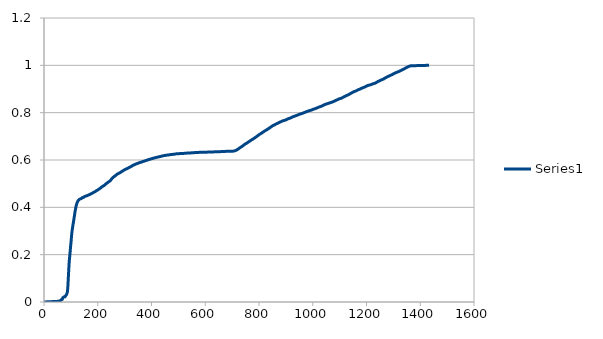
| Category | Series 0 |
|---|---|
| 0.0 | 0 |
| 56.0 | 0.003 |
| 59.0 | 0.004 |
| 60.0 | 0.005 |
| 63.0 | 0.007 |
| 64.0 | 0.009 |
| 65.0 | 0.01 |
| 66.0 | 0.01 |
| 68.0 | 0.011 |
| 69.0 | 0.012 |
| 70.0 | 0.018 |
| 74.0 | 0.021 |
| 75.0 | 0.022 |
| 77.0 | 0.022 |
| 78.0 | 0.022 |
| 79.0 | 0.022 |
| 80.0 | 0.024 |
| 81.0 | 0.027 |
| 82.0 | 0.031 |
| 83.0 | 0.031 |
| 84.0 | 0.032 |
| 85.0 | 0.033 |
| 86.0 | 0.035 |
| 87.0 | 0.043 |
| 88.0 | 0.054 |
| 89.0 | 0.069 |
| 90.0 | 0.092 |
| 91.0 | 0.114 |
| 92.0 | 0.134 |
| 93.0 | 0.155 |
| 94.0 | 0.173 |
| 95.0 | 0.184 |
| 96.0 | 0.196 |
| 97.0 | 0.209 |
| 98.0 | 0.222 |
| 99.0 | 0.235 |
| 100.0 | 0.246 |
| 101.0 | 0.259 |
| 102.0 | 0.272 |
| 103.0 | 0.285 |
| 104.0 | 0.296 |
| 105.0 | 0.305 |
| 106.0 | 0.312 |
| 107.0 | 0.32 |
| 108.0 | 0.327 |
| 109.0 | 0.334 |
| 110.0 | 0.341 |
| 111.0 | 0.348 |
| 112.0 | 0.355 |
| 113.0 | 0.363 |
| 114.0 | 0.37 |
| 115.0 | 0.379 |
| 116.0 | 0.385 |
| 117.0 | 0.391 |
| 118.0 | 0.396 |
| 119.0 | 0.403 |
| 120.0 | 0.408 |
| 121.0 | 0.412 |
| 122.0 | 0.416 |
| 123.0 | 0.419 |
| 124.0 | 0.422 |
| 125.0 | 0.424 |
| 126.0 | 0.427 |
| 127.0 | 0.429 |
| 128.0 | 0.431 |
| 129.0 | 0.432 |
| 130.0 | 0.433 |
| 131.0 | 0.433 |
| 132.0 | 0.434 |
| 133.0 | 0.434 |
| 134.0 | 0.435 |
| 135.0 | 0.436 |
| 136.0 | 0.437 |
| 137.0 | 0.437 |
| 138.0 | 0.437 |
| 139.0 | 0.437 |
| 140.0 | 0.439 |
| 141.0 | 0.44 |
| 142.0 | 0.441 |
| 143.0 | 0.441 |
| 144.0 | 0.441 |
| 145.0 | 0.441 |
| 146.0 | 0.442 |
| 147.0 | 0.442 |
| 148.0 | 0.443 |
| 149.0 | 0.444 |
| 150.0 | 0.445 |
| 151.0 | 0.446 |
| 152.0 | 0.446 |
| 153.0 | 0.447 |
| 154.0 | 0.447 |
| 155.0 | 0.447 |
| 156.0 | 0.448 |
| 158.0 | 0.449 |
| 159.0 | 0.449 |
| 160.0 | 0.449 |
| 161.0 | 0.45 |
| 162.0 | 0.45 |
| 163.0 | 0.451 |
| 164.0 | 0.451 |
| 165.0 | 0.451 |
| 166.0 | 0.452 |
| 167.0 | 0.452 |
| 168.0 | 0.453 |
| 169.0 | 0.453 |
| 170.0 | 0.454 |
| 171.0 | 0.455 |
| 172.0 | 0.456 |
| 173.0 | 0.456 |
| 174.0 | 0.457 |
| 175.0 | 0.457 |
| 176.0 | 0.458 |
| 177.0 | 0.459 |
| 178.0 | 0.459 |
| 179.0 | 0.459 |
| 180.0 | 0.46 |
| 181.0 | 0.461 |
| 182.0 | 0.461 |
| 183.0 | 0.462 |
| 184.0 | 0.463 |
| 185.0 | 0.464 |
| 186.0 | 0.464 |
| 187.0 | 0.464 |
| 188.0 | 0.465 |
| 189.0 | 0.465 |
| 190.0 | 0.466 |
| 191.0 | 0.467 |
| 192.0 | 0.468 |
| 193.0 | 0.468 |
| 194.0 | 0.47 |
| 195.0 | 0.47 |
| 196.0 | 0.471 |
| 197.0 | 0.471 |
| 198.0 | 0.472 |
| 199.0 | 0.473 |
| 200.0 | 0.473 |
| 201.0 | 0.474 |
| 202.0 | 0.475 |
| 203.0 | 0.476 |
| 204.0 | 0.476 |
| 205.0 | 0.477 |
| 206.0 | 0.478 |
| 207.0 | 0.479 |
| 208.0 | 0.48 |
| 209.0 | 0.481 |
| 210.0 | 0.482 |
| 211.0 | 0.482 |
| 212.0 | 0.483 |
| 213.0 | 0.484 |
| 214.0 | 0.485 |
| 215.0 | 0.486 |
| 216.0 | 0.487 |
| 217.0 | 0.487 |
| 218.0 | 0.488 |
| 219.0 | 0.489 |
| 220.0 | 0.49 |
| 221.0 | 0.49 |
| 222.0 | 0.491 |
| 223.0 | 0.492 |
| 224.0 | 0.492 |
| 225.0 | 0.493 |
| 226.0 | 0.494 |
| 227.0 | 0.495 |
| 228.0 | 0.496 |
| 229.0 | 0.497 |
| 230.0 | 0.498 |
| 231.0 | 0.5 |
| 232.0 | 0.501 |
| 233.0 | 0.501 |
| 234.0 | 0.502 |
| 235.0 | 0.503 |
| 236.0 | 0.504 |
| 237.0 | 0.505 |
| 238.0 | 0.506 |
| 239.0 | 0.506 |
| 240.0 | 0.507 |
| 241.0 | 0.508 |
| 242.0 | 0.509 |
| 243.0 | 0.51 |
| 244.0 | 0.51 |
| 245.0 | 0.511 |
| 246.0 | 0.512 |
| 247.0 | 0.513 |
| 248.0 | 0.513 |
| 249.0 | 0.514 |
| 250.0 | 0.514 |
| 251.0 | 0.519 |
| 252.0 | 0.521 |
| 253.0 | 0.522 |
| 254.0 | 0.523 |
| 255.0 | 0.524 |
| 256.0 | 0.525 |
| 257.0 | 0.526 |
| 258.0 | 0.528 |
| 259.0 | 0.528 |
| 260.0 | 0.529 |
| 261.0 | 0.53 |
| 262.0 | 0.531 |
| 263.0 | 0.532 |
| 264.0 | 0.533 |
| 265.0 | 0.533 |
| 266.0 | 0.534 |
| 267.0 | 0.535 |
| 268.0 | 0.536 |
| 269.0 | 0.537 |
| 270.0 | 0.538 |
| 271.0 | 0.539 |
| 272.0 | 0.54 |
| 273.0 | 0.541 |
| 274.0 | 0.541 |
| 275.0 | 0.542 |
| 276.0 | 0.543 |
| 277.0 | 0.543 |
| 278.0 | 0.544 |
| 279.0 | 0.544 |
| 280.0 | 0.545 |
| 281.0 | 0.546 |
| 282.0 | 0.546 |
| 283.0 | 0.547 |
| 284.0 | 0.547 |
| 285.0 | 0.548 |
| 286.0 | 0.549 |
| 287.0 | 0.549 |
| 288.0 | 0.55 |
| 289.0 | 0.551 |
| 290.0 | 0.551 |
| 291.0 | 0.552 |
| 292.0 | 0.554 |
| 293.0 | 0.554 |
| 294.0 | 0.554 |
| 295.0 | 0.555 |
| 296.0 | 0.556 |
| 297.0 | 0.557 |
| 298.0 | 0.558 |
| 299.0 | 0.558 |
| 300.0 | 0.559 |
| 301.0 | 0.559 |
| 302.0 | 0.56 |
| 303.0 | 0.56 |
| 304.0 | 0.561 |
| 305.0 | 0.561 |
| 306.0 | 0.562 |
| 307.0 | 0.563 |
| 308.0 | 0.563 |
| 309.0 | 0.563 |
| 310.0 | 0.564 |
| 311.0 | 0.564 |
| 312.0 | 0.565 |
| 313.0 | 0.566 |
| 314.0 | 0.567 |
| 315.0 | 0.568 |
| 316.0 | 0.568 |
| 317.0 | 0.569 |
| 318.0 | 0.569 |
| 319.0 | 0.569 |
| 320.0 | 0.57 |
| 321.0 | 0.571 |
| 322.0 | 0.571 |
| 323.0 | 0.572 |
| 324.0 | 0.573 |
| 325.0 | 0.573 |
| 326.0 | 0.574 |
| 327.0 | 0.575 |
| 328.0 | 0.575 |
| 329.0 | 0.576 |
| 330.0 | 0.577 |
| 331.0 | 0.578 |
| 332.0 | 0.578 |
| 333.0 | 0.579 |
| 335.0 | 0.579 |
| 336.0 | 0.58 |
| 337.0 | 0.581 |
| 338.0 | 0.581 |
| 339.0 | 0.581 |
| 340.0 | 0.582 |
| 341.0 | 0.583 |
| 342.0 | 0.583 |
| 343.0 | 0.584 |
| 344.0 | 0.584 |
| 345.0 | 0.584 |
| 346.0 | 0.585 |
| 347.0 | 0.585 |
| 348.0 | 0.585 |
| 349.0 | 0.586 |
| 350.0 | 0.587 |
| 351.0 | 0.587 |
| 352.0 | 0.587 |
| 353.0 | 0.588 |
| 354.0 | 0.589 |
| 355.0 | 0.589 |
| 356.0 | 0.589 |
| 357.0 | 0.589 |
| 358.0 | 0.59 |
| 359.0 | 0.59 |
| 360.0 | 0.59 |
| 361.0 | 0.59 |
| 362.0 | 0.591 |
| 363.0 | 0.591 |
| 364.0 | 0.592 |
| 365.0 | 0.592 |
| 366.0 | 0.593 |
| 367.0 | 0.593 |
| 368.0 | 0.593 |
| 369.0 | 0.594 |
| 370.0 | 0.595 |
| 371.0 | 0.595 |
| 372.0 | 0.595 |
| 373.0 | 0.595 |
| 374.0 | 0.596 |
| 375.0 | 0.596 |
| 376.0 | 0.597 |
| 377.0 | 0.597 |
| 378.0 | 0.598 |
| 379.0 | 0.598 |
| 380.0 | 0.598 |
| 381.0 | 0.599 |
| 382.0 | 0.599 |
| 383.0 | 0.599 |
| 384.0 | 0.599 |
| 385.0 | 0.6 |
| 386.0 | 0.6 |
| 387.0 | 0.601 |
| 388.0 | 0.601 |
| 389.0 | 0.602 |
| 390.0 | 0.602 |
| 392.0 | 0.603 |
| 393.0 | 0.603 |
| 394.0 | 0.603 |
| 395.0 | 0.603 |
| 396.0 | 0.604 |
| 397.0 | 0.604 |
| 398.0 | 0.605 |
| 399.0 | 0.605 |
| 400.0 | 0.605 |
| 401.0 | 0.605 |
| 402.0 | 0.606 |
| 403.0 | 0.606 |
| 404.0 | 0.607 |
| 405.0 | 0.607 |
| 406.0 | 0.607 |
| 407.0 | 0.607 |
| 408.0 | 0.608 |
| 409.0 | 0.608 |
| 410.0 | 0.609 |
| 411.0 | 0.609 |
| 412.0 | 0.609 |
| 413.0 | 0.609 |
| 414.0 | 0.61 |
| 415.0 | 0.61 |
| 416.0 | 0.61 |
| 417.0 | 0.611 |
| 418.0 | 0.611 |
| 419.0 | 0.611 |
| 420.0 | 0.611 |
| 421.0 | 0.612 |
| 422.0 | 0.612 |
| 423.0 | 0.612 |
| 424.0 | 0.613 |
| 425.0 | 0.613 |
| 426.0 | 0.613 |
| 427.0 | 0.614 |
| 429.0 | 0.614 |
| 430.0 | 0.614 |
| 431.0 | 0.614 |
| 432.0 | 0.615 |
| 433.0 | 0.615 |
| 434.0 | 0.615 |
| 436.0 | 0.615 |
| 437.0 | 0.616 |
| 438.0 | 0.617 |
| 439.0 | 0.617 |
| 440.0 | 0.617 |
| 441.0 | 0.617 |
| 442.0 | 0.617 |
| 443.0 | 0.617 |
| 444.0 | 0.618 |
| 445.0 | 0.618 |
| 446.0 | 0.619 |
| 447.0 | 0.619 |
| 448.0 | 0.619 |
| 450.0 | 0.619 |
| 451.0 | 0.62 |
| 452.0 | 0.62 |
| 453.0 | 0.62 |
| 454.0 | 0.62 |
| 455.0 | 0.62 |
| 456.0 | 0.621 |
| 458.0 | 0.621 |
| 460.0 | 0.621 |
| 461.0 | 0.621 |
| 463.0 | 0.621 |
| 464.0 | 0.622 |
| 465.0 | 0.622 |
| 466.0 | 0.622 |
| 467.0 | 0.622 |
| 468.0 | 0.622 |
| 469.0 | 0.623 |
| 470.0 | 0.623 |
| 472.0 | 0.623 |
| 473.0 | 0.623 |
| 475.0 | 0.623 |
| 476.0 | 0.623 |
| 477.0 | 0.624 |
| 480.0 | 0.624 |
| 481.0 | 0.624 |
| 482.0 | 0.624 |
| 483.0 | 0.625 |
| 486.0 | 0.625 |
| 487.0 | 0.625 |
| 488.0 | 0.625 |
| 489.0 | 0.626 |
| 490.0 | 0.626 |
| 492.0 | 0.626 |
| 495.0 | 0.626 |
| 496.0 | 0.626 |
| 497.0 | 0.626 |
| 498.0 | 0.627 |
| 500.0 | 0.627 |
| 501.0 | 0.627 |
| 505.0 | 0.627 |
| 507.0 | 0.627 |
| 508.0 | 0.627 |
| 513.0 | 0.627 |
| 515.0 | 0.628 |
| 518.0 | 0.628 |
| 519.0 | 0.628 |
| 520.0 | 0.628 |
| 521.0 | 0.628 |
| 522.0 | 0.628 |
| 523.0 | 0.628 |
| 524.0 | 0.628 |
| 525.0 | 0.629 |
| 526.0 | 0.629 |
| 528.0 | 0.629 |
| 529.0 | 0.629 |
| 530.0 | 0.629 |
| 532.0 | 0.629 |
| 535.0 | 0.629 |
| 540.0 | 0.629 |
| 541.0 | 0.63 |
| 542.0 | 0.63 |
| 543.0 | 0.63 |
| 546.0 | 0.63 |
| 547.0 | 0.63 |
| 548.0 | 0.63 |
| 549.0 | 0.631 |
| 554.0 | 0.631 |
| 555.0 | 0.631 |
| 557.0 | 0.631 |
| 559.0 | 0.631 |
| 560.0 | 0.631 |
| 563.0 | 0.631 |
| 565.0 | 0.631 |
| 567.0 | 0.632 |
| 568.0 | 0.632 |
| 570.0 | 0.632 |
| 572.0 | 0.632 |
| 576.0 | 0.632 |
| 581.0 | 0.632 |
| 582.0 | 0.633 |
| 586.0 | 0.633 |
| 589.0 | 0.633 |
| 595.0 | 0.633 |
| 599.0 | 0.633 |
| 603.0 | 0.633 |
| 606.0 | 0.633 |
| 609.0 | 0.633 |
| 611.0 | 0.633 |
| 623.0 | 0.634 |
| 624.0 | 0.634 |
| 625.0 | 0.634 |
| 629.0 | 0.634 |
| 630.0 | 0.634 |
| 631.0 | 0.634 |
| 632.0 | 0.635 |
| 635.0 | 0.635 |
| 643.0 | 0.635 |
| 648.0 | 0.635 |
| 650.0 | 0.635 |
| 651.0 | 0.635 |
| 657.0 | 0.635 |
| 658.0 | 0.635 |
| 664.0 | 0.636 |
| 665.0 | 0.636 |
| 667.0 | 0.636 |
| 670.0 | 0.636 |
| 672.0 | 0.636 |
| 673.0 | 0.636 |
| 675.0 | 0.636 |
| 676.0 | 0.637 |
| 679.0 | 0.637 |
| 685.0 | 0.637 |
| 686.0 | 0.637 |
| 689.0 | 0.637 |
| 696.0 | 0.637 |
| 697.0 | 0.637 |
| 701.0 | 0.637 |
| 703.0 | 0.637 |
| 706.0 | 0.638 |
| 707.0 | 0.638 |
| 708.0 | 0.638 |
| 709.0 | 0.639 |
| 710.0 | 0.639 |
| 711.0 | 0.639 |
| 712.0 | 0.639 |
| 713.0 | 0.64 |
| 714.0 | 0.641 |
| 715.0 | 0.641 |
| 716.0 | 0.642 |
| 717.0 | 0.642 |
| 718.0 | 0.643 |
| 719.0 | 0.644 |
| 720.0 | 0.644 |
| 721.0 | 0.645 |
| 722.0 | 0.646 |
| 723.0 | 0.647 |
| 724.0 | 0.648 |
| 725.0 | 0.648 |
| 726.0 | 0.649 |
| 727.0 | 0.65 |
| 728.0 | 0.651 |
| 729.0 | 0.652 |
| 730.0 | 0.652 |
| 731.0 | 0.654 |
| 732.0 | 0.654 |
| 733.0 | 0.655 |
| 734.0 | 0.655 |
| 735.0 | 0.656 |
| 736.0 | 0.657 |
| 737.0 | 0.658 |
| 738.0 | 0.658 |
| 739.0 | 0.659 |
| 740.0 | 0.66 |
| 741.0 | 0.661 |
| 742.0 | 0.662 |
| 743.0 | 0.662 |
| 744.0 | 0.663 |
| 745.0 | 0.664 |
| 746.0 | 0.666 |
| 747.0 | 0.666 |
| 748.0 | 0.667 |
| 749.0 | 0.668 |
| 750.0 | 0.669 |
| 751.0 | 0.669 |
| 752.0 | 0.67 |
| 753.0 | 0.67 |
| 754.0 | 0.671 |
| 755.0 | 0.672 |
| 756.0 | 0.672 |
| 757.0 | 0.673 |
| 758.0 | 0.674 |
| 759.0 | 0.675 |
| 760.0 | 0.675 |
| 761.0 | 0.676 |
| 762.0 | 0.677 |
| 763.0 | 0.678 |
| 764.0 | 0.679 |
| 765.0 | 0.679 |
| 766.0 | 0.68 |
| 767.0 | 0.681 |
| 768.0 | 0.682 |
| 769.0 | 0.683 |
| 770.0 | 0.683 |
| 771.0 | 0.684 |
| 772.0 | 0.684 |
| 773.0 | 0.685 |
| 774.0 | 0.686 |
| 775.0 | 0.687 |
| 776.0 | 0.687 |
| 777.0 | 0.688 |
| 778.0 | 0.689 |
| 779.0 | 0.69 |
| 780.0 | 0.69 |
| 781.0 | 0.691 |
| 782.0 | 0.692 |
| 783.0 | 0.693 |
| 784.0 | 0.694 |
| 785.0 | 0.694 |
| 786.0 | 0.695 |
| 787.0 | 0.696 |
| 788.0 | 0.696 |
| 789.0 | 0.697 |
| 790.0 | 0.698 |
| 791.0 | 0.699 |
| 792.0 | 0.7 |
| 793.0 | 0.701 |
| 794.0 | 0.701 |
| 795.0 | 0.703 |
| 796.0 | 0.703 |
| 797.0 | 0.704 |
| 798.0 | 0.705 |
| 799.0 | 0.706 |
| 800.0 | 0.706 |
| 801.0 | 0.708 |
| 802.0 | 0.708 |
| 803.0 | 0.709 |
| 804.0 | 0.71 |
| 805.0 | 0.71 |
| 806.0 | 0.711 |
| 807.0 | 0.712 |
| 808.0 | 0.713 |
| 809.0 | 0.713 |
| 810.0 | 0.714 |
| 811.0 | 0.714 |
| 812.0 | 0.715 |
| 813.0 | 0.716 |
| 814.0 | 0.717 |
| 815.0 | 0.718 |
| 816.0 | 0.719 |
| 817.0 | 0.719 |
| 818.0 | 0.72 |
| 819.0 | 0.721 |
| 820.0 | 0.722 |
| 821.0 | 0.723 |
| 822.0 | 0.723 |
| 823.0 | 0.724 |
| 824.0 | 0.725 |
| 825.0 | 0.725 |
| 826.0 | 0.726 |
| 827.0 | 0.727 |
| 828.0 | 0.728 |
| 829.0 | 0.728 |
| 830.0 | 0.728 |
| 831.0 | 0.729 |
| 832.0 | 0.73 |
| 833.0 | 0.731 |
| 834.0 | 0.732 |
| 835.0 | 0.732 |
| 836.0 | 0.733 |
| 837.0 | 0.734 |
| 838.0 | 0.734 |
| 839.0 | 0.735 |
| 840.0 | 0.736 |
| 841.0 | 0.737 |
| 842.0 | 0.738 |
| 843.0 | 0.738 |
| 844.0 | 0.74 |
| 845.0 | 0.74 |
| 846.0 | 0.741 |
| 847.0 | 0.742 |
| 848.0 | 0.742 |
| 849.0 | 0.743 |
| 850.0 | 0.744 |
| 851.0 | 0.744 |
| 852.0 | 0.745 |
| 853.0 | 0.746 |
| 854.0 | 0.747 |
| 855.0 | 0.747 |
| 856.0 | 0.747 |
| 857.0 | 0.748 |
| 858.0 | 0.748 |
| 859.0 | 0.749 |
| 860.0 | 0.75 |
| 861.0 | 0.751 |
| 862.0 | 0.751 |
| 863.0 | 0.752 |
| 864.0 | 0.752 |
| 865.0 | 0.753 |
| 866.0 | 0.754 |
| 867.0 | 0.754 |
| 868.0 | 0.755 |
| 869.0 | 0.755 |
| 870.0 | 0.755 |
| 871.0 | 0.756 |
| 872.0 | 0.756 |
| 873.0 | 0.757 |
| 874.0 | 0.758 |
| 875.0 | 0.759 |
| 876.0 | 0.759 |
| 877.0 | 0.759 |
| 878.0 | 0.76 |
| 879.0 | 0.76 |
| 880.0 | 0.761 |
| 881.0 | 0.762 |
| 882.0 | 0.762 |
| 883.0 | 0.763 |
| 884.0 | 0.763 |
| 885.0 | 0.764 |
| 886.0 | 0.765 |
| 887.0 | 0.765 |
| 888.0 | 0.765 |
| 889.0 | 0.766 |
| 890.0 | 0.766 |
| 891.0 | 0.767 |
| 892.0 | 0.767 |
| 893.0 | 0.767 |
| 895.0 | 0.767 |
| 896.0 | 0.768 |
| 897.0 | 0.768 |
| 898.0 | 0.769 |
| 899.0 | 0.769 |
| 900.0 | 0.769 |
| 901.0 | 0.77 |
| 902.0 | 0.77 |
| 903.0 | 0.771 |
| 904.0 | 0.772 |
| 905.0 | 0.772 |
| 906.0 | 0.773 |
| 907.0 | 0.773 |
| 908.0 | 0.774 |
| 909.0 | 0.774 |
| 910.0 | 0.775 |
| 911.0 | 0.775 |
| 912.0 | 0.776 |
| 913.0 | 0.776 |
| 914.0 | 0.776 |
| 915.0 | 0.777 |
| 916.0 | 0.777 |
| 917.0 | 0.778 |
| 918.0 | 0.778 |
| 919.0 | 0.778 |
| 920.0 | 0.779 |
| 921.0 | 0.78 |
| 922.0 | 0.78 |
| 923.0 | 0.781 |
| 924.0 | 0.781 |
| 925.0 | 0.782 |
| 926.0 | 0.783 |
| 927.0 | 0.783 |
| 928.0 | 0.783 |
| 929.0 | 0.784 |
| 930.0 | 0.784 |
| 931.0 | 0.785 |
| 932.0 | 0.785 |
| 933.0 | 0.785 |
| 934.0 | 0.786 |
| 935.0 | 0.786 |
| 936.0 | 0.787 |
| 938.0 | 0.787 |
| 939.0 | 0.788 |
| 940.0 | 0.788 |
| 941.0 | 0.789 |
| 942.0 | 0.789 |
| 943.0 | 0.789 |
| 944.0 | 0.79 |
| 945.0 | 0.791 |
| 946.0 | 0.791 |
| 947.0 | 0.792 |
| 948.0 | 0.792 |
| 949.0 | 0.792 |
| 950.0 | 0.793 |
| 951.0 | 0.793 |
| 953.0 | 0.794 |
| 954.0 | 0.795 |
| 955.0 | 0.795 |
| 956.0 | 0.795 |
| 957.0 | 0.796 |
| 958.0 | 0.796 |
| 959.0 | 0.796 |
| 960.0 | 0.797 |
| 961.0 | 0.797 |
| 962.0 | 0.798 |
| 963.0 | 0.798 |
| 964.0 | 0.798 |
| 965.0 | 0.799 |
| 966.0 | 0.799 |
| 967.0 | 0.8 |
| 968.0 | 0.8 |
| 969.0 | 0.801 |
| 970.0 | 0.801 |
| 971.0 | 0.802 |
| 972.0 | 0.802 |
| 973.0 | 0.803 |
| 974.0 | 0.803 |
| 975.0 | 0.804 |
| 976.0 | 0.804 |
| 977.0 | 0.804 |
| 978.0 | 0.804 |
| 979.0 | 0.805 |
| 980.0 | 0.805 |
| 981.0 | 0.806 |
| 982.0 | 0.806 |
| 983.0 | 0.807 |
| 984.0 | 0.807 |
| 985.0 | 0.808 |
| 986.0 | 0.808 |
| 987.0 | 0.808 |
| 988.0 | 0.809 |
| 989.0 | 0.809 |
| 990.0 | 0.809 |
| 991.0 | 0.81 |
| 992.0 | 0.81 |
| 993.0 | 0.81 |
| 994.0 | 0.811 |
| 995.0 | 0.811 |
| 996.0 | 0.812 |
| 997.0 | 0.812 |
| 998.0 | 0.813 |
| 999.0 | 0.813 |
| 1000.0 | 0.814 |
| 1001.0 | 0.814 |
| 1002.0 | 0.814 |
| 1003.0 | 0.815 |
| 1004.0 | 0.815 |
| 1005.0 | 0.815 |
| 1006.0 | 0.815 |
| 1007.0 | 0.816 |
| 1008.0 | 0.816 |
| 1009.0 | 0.817 |
| 1010.0 | 0.817 |
| 1011.0 | 0.818 |
| 1012.0 | 0.819 |
| 1013.0 | 0.819 |
| 1014.0 | 0.82 |
| 1015.0 | 0.82 |
| 1016.0 | 0.82 |
| 1017.0 | 0.821 |
| 1018.0 | 0.821 |
| 1019.0 | 0.822 |
| 1020.0 | 0.822 |
| 1021.0 | 0.823 |
| 1022.0 | 0.823 |
| 1023.0 | 0.824 |
| 1024.0 | 0.824 |
| 1025.0 | 0.824 |
| 1026.0 | 0.825 |
| 1027.0 | 0.825 |
| 1028.0 | 0.826 |
| 1029.0 | 0.826 |
| 1030.0 | 0.826 |
| 1031.0 | 0.827 |
| 1032.0 | 0.827 |
| 1033.0 | 0.828 |
| 1034.0 | 0.828 |
| 1035.0 | 0.829 |
| 1036.0 | 0.829 |
| 1037.0 | 0.83 |
| 1038.0 | 0.831 |
| 1039.0 | 0.831 |
| 1040.0 | 0.832 |
| 1041.0 | 0.832 |
| 1042.0 | 0.833 |
| 1043.0 | 0.833 |
| 1044.0 | 0.834 |
| 1045.0 | 0.834 |
| 1046.0 | 0.835 |
| 1047.0 | 0.835 |
| 1048.0 | 0.836 |
| 1049.0 | 0.836 |
| 1050.0 | 0.836 |
| 1051.0 | 0.837 |
| 1052.0 | 0.837 |
| 1053.0 | 0.838 |
| 1054.0 | 0.838 |
| 1055.0 | 0.838 |
| 1056.0 | 0.839 |
| 1057.0 | 0.839 |
| 1058.0 | 0.839 |
| 1059.0 | 0.84 |
| 1060.0 | 0.84 |
| 1061.0 | 0.841 |
| 1062.0 | 0.841 |
| 1063.0 | 0.841 |
| 1064.0 | 0.842 |
| 1065.0 | 0.842 |
| 1066.0 | 0.843 |
| 1067.0 | 0.843 |
| 1068.0 | 0.843 |
| 1069.0 | 0.843 |
| 1070.0 | 0.844 |
| 1071.0 | 0.844 |
| 1072.0 | 0.845 |
| 1073.0 | 0.846 |
| 1074.0 | 0.846 |
| 1075.0 | 0.846 |
| 1076.0 | 0.847 |
| 1077.0 | 0.847 |
| 1078.0 | 0.847 |
| 1079.0 | 0.848 |
| 1080.0 | 0.848 |
| 1081.0 | 0.849 |
| 1082.0 | 0.849 |
| 1083.0 | 0.85 |
| 1084.0 | 0.851 |
| 1085.0 | 0.851 |
| 1086.0 | 0.852 |
| 1087.0 | 0.852 |
| 1088.0 | 0.853 |
| 1089.0 | 0.854 |
| 1090.0 | 0.854 |
| 1091.0 | 0.854 |
| 1092.0 | 0.855 |
| 1093.0 | 0.856 |
| 1094.0 | 0.856 |
| 1095.0 | 0.857 |
| 1096.0 | 0.857 |
| 1097.0 | 0.858 |
| 1098.0 | 0.858 |
| 1099.0 | 0.859 |
| 1100.0 | 0.859 |
| 1101.0 | 0.859 |
| 1102.0 | 0.859 |
| 1103.0 | 0.86 |
| 1104.0 | 0.86 |
| 1105.0 | 0.86 |
| 1106.0 | 0.861 |
| 1107.0 | 0.861 |
| 1108.0 | 0.861 |
| 1109.0 | 0.862 |
| 1110.0 | 0.863 |
| 1111.0 | 0.864 |
| 1112.0 | 0.864 |
| 1113.0 | 0.865 |
| 1114.0 | 0.866 |
| 1115.0 | 0.866 |
| 1116.0 | 0.867 |
| 1117.0 | 0.868 |
| 1118.0 | 0.868 |
| 1119.0 | 0.868 |
| 1120.0 | 0.869 |
| 1121.0 | 0.87 |
| 1122.0 | 0.87 |
| 1123.0 | 0.871 |
| 1124.0 | 0.871 |
| 1125.0 | 0.872 |
| 1126.0 | 0.872 |
| 1127.0 | 0.873 |
| 1128.0 | 0.874 |
| 1129.0 | 0.874 |
| 1130.0 | 0.875 |
| 1131.0 | 0.875 |
| 1132.0 | 0.876 |
| 1133.0 | 0.876 |
| 1134.0 | 0.877 |
| 1135.0 | 0.877 |
| 1136.0 | 0.878 |
| 1137.0 | 0.878 |
| 1138.0 | 0.879 |
| 1139.0 | 0.88 |
| 1140.0 | 0.881 |
| 1141.0 | 0.881 |
| 1142.0 | 0.882 |
| 1143.0 | 0.882 |
| 1144.0 | 0.883 |
| 1145.0 | 0.884 |
| 1146.0 | 0.884 |
| 1147.0 | 0.885 |
| 1148.0 | 0.885 |
| 1149.0 | 0.886 |
| 1150.0 | 0.887 |
| 1151.0 | 0.888 |
| 1152.0 | 0.888 |
| 1153.0 | 0.888 |
| 1154.0 | 0.889 |
| 1155.0 | 0.889 |
| 1156.0 | 0.89 |
| 1157.0 | 0.89 |
| 1158.0 | 0.891 |
| 1159.0 | 0.891 |
| 1160.0 | 0.891 |
| 1161.0 | 0.892 |
| 1162.0 | 0.893 |
| 1163.0 | 0.893 |
| 1164.0 | 0.894 |
| 1165.0 | 0.894 |
| 1166.0 | 0.895 |
| 1167.0 | 0.896 |
| 1168.0 | 0.896 |
| 1169.0 | 0.897 |
| 1170.0 | 0.897 |
| 1171.0 | 0.898 |
| 1172.0 | 0.898 |
| 1173.0 | 0.899 |
| 1174.0 | 0.899 |
| 1175.0 | 0.899 |
| 1176.0 | 0.899 |
| 1177.0 | 0.9 |
| 1178.0 | 0.901 |
| 1179.0 | 0.901 |
| 1180.0 | 0.902 |
| 1181.0 | 0.902 |
| 1182.0 | 0.903 |
| 1183.0 | 0.904 |
| 1184.0 | 0.904 |
| 1185.0 | 0.905 |
| 1186.0 | 0.905 |
| 1187.0 | 0.905 |
| 1188.0 | 0.906 |
| 1189.0 | 0.906 |
| 1190.0 | 0.907 |
| 1191.0 | 0.907 |
| 1192.0 | 0.908 |
| 1193.0 | 0.908 |
| 1194.0 | 0.909 |
| 1195.0 | 0.909 |
| 1196.0 | 0.91 |
| 1197.0 | 0.911 |
| 1198.0 | 0.911 |
| 1199.0 | 0.912 |
| 1200.0 | 0.912 |
| 1201.0 | 0.913 |
| 1202.0 | 0.914 |
| 1203.0 | 0.914 |
| 1204.0 | 0.914 |
| 1205.0 | 0.915 |
| 1206.0 | 0.915 |
| 1207.0 | 0.916 |
| 1208.0 | 0.916 |
| 1210.0 | 0.916 |
| 1211.0 | 0.917 |
| 1212.0 | 0.917 |
| 1213.0 | 0.917 |
| 1214.0 | 0.918 |
| 1215.0 | 0.918 |
| 1216.0 | 0.918 |
| 1217.0 | 0.919 |
| 1218.0 | 0.919 |
| 1219.0 | 0.92 |
| 1221.0 | 0.92 |
| 1222.0 | 0.921 |
| 1223.0 | 0.921 |
| 1224.0 | 0.922 |
| 1225.0 | 0.922 |
| 1226.0 | 0.923 |
| 1227.0 | 0.923 |
| 1228.0 | 0.923 |
| 1229.0 | 0.924 |
| 1230.0 | 0.924 |
| 1231.0 | 0.924 |
| 1232.0 | 0.925 |
| 1233.0 | 0.925 |
| 1234.0 | 0.926 |
| 1235.0 | 0.926 |
| 1236.0 | 0.927 |
| 1237.0 | 0.928 |
| 1238.0 | 0.928 |
| 1239.0 | 0.929 |
| 1240.0 | 0.93 |
| 1241.0 | 0.931 |
| 1242.0 | 0.931 |
| 1243.0 | 0.932 |
| 1244.0 | 0.932 |
| 1245.0 | 0.933 |
| 1246.0 | 0.934 |
| 1248.0 | 0.934 |
| 1249.0 | 0.935 |
| 1250.0 | 0.936 |
| 1251.0 | 0.936 |
| 1252.0 | 0.937 |
| 1253.0 | 0.937 |
| 1254.0 | 0.938 |
| 1255.0 | 0.938 |
| 1256.0 | 0.939 |
| 1257.0 | 0.939 |
| 1258.0 | 0.939 |
| 1259.0 | 0.94 |
| 1260.0 | 0.94 |
| 1261.0 | 0.941 |
| 1262.0 | 0.942 |
| 1263.0 | 0.942 |
| 1264.0 | 0.942 |
| 1265.0 | 0.943 |
| 1266.0 | 0.944 |
| 1267.0 | 0.945 |
| 1268.0 | 0.946 |
| 1269.0 | 0.946 |
| 1270.0 | 0.947 |
| 1271.0 | 0.947 |
| 1272.0 | 0.948 |
| 1273.0 | 0.949 |
| 1274.0 | 0.949 |
| 1275.0 | 0.95 |
| 1276.0 | 0.951 |
| 1277.0 | 0.951 |
| 1278.0 | 0.952 |
| 1279.0 | 0.953 |
| 1280.0 | 0.953 |
| 1281.0 | 0.953 |
| 1282.0 | 0.954 |
| 1283.0 | 0.954 |
| 1284.0 | 0.955 |
| 1285.0 | 0.955 |
| 1286.0 | 0.956 |
| 1287.0 | 0.956 |
| 1288.0 | 0.957 |
| 1289.0 | 0.958 |
| 1290.0 | 0.958 |
| 1291.0 | 0.958 |
| 1292.0 | 0.959 |
| 1293.0 | 0.96 |
| 1294.0 | 0.96 |
| 1295.0 | 0.961 |
| 1296.0 | 0.961 |
| 1297.0 | 0.962 |
| 1298.0 | 0.963 |
| 1299.0 | 0.963 |
| 1300.0 | 0.964 |
| 1301.0 | 0.964 |
| 1302.0 | 0.965 |
| 1303.0 | 0.966 |
| 1304.0 | 0.966 |
| 1305.0 | 0.967 |
| 1306.0 | 0.967 |
| 1307.0 | 0.967 |
| 1308.0 | 0.968 |
| 1309.0 | 0.969 |
| 1310.0 | 0.969 |
| 1311.0 | 0.969 |
| 1312.0 | 0.97 |
| 1313.0 | 0.971 |
| 1314.0 | 0.971 |
| 1315.0 | 0.971 |
| 1316.0 | 0.972 |
| 1317.0 | 0.972 |
| 1318.0 | 0.973 |
| 1319.0 | 0.973 |
| 1320.0 | 0.974 |
| 1321.0 | 0.974 |
| 1322.0 | 0.974 |
| 1323.0 | 0.975 |
| 1324.0 | 0.976 |
| 1325.0 | 0.976 |
| 1326.0 | 0.977 |
| 1327.0 | 0.977 |
| 1328.0 | 0.978 |
| 1329.0 | 0.979 |
| 1330.0 | 0.979 |
| 1331.0 | 0.98 |
| 1332.0 | 0.981 |
| 1333.0 | 0.981 |
| 1334.0 | 0.982 |
| 1335.0 | 0.982 |
| 1336.0 | 0.983 |
| 1337.0 | 0.983 |
| 1338.0 | 0.984 |
| 1339.0 | 0.985 |
| 1340.0 | 0.985 |
| 1341.0 | 0.985 |
| 1342.0 | 0.986 |
| 1343.0 | 0.987 |
| 1344.0 | 0.988 |
| 1345.0 | 0.989 |
| 1346.0 | 0.989 |
| 1347.0 | 0.99 |
| 1348.0 | 0.99 |
| 1349.0 | 0.991 |
| 1350.0 | 0.991 |
| 1351.0 | 0.992 |
| 1352.0 | 0.992 |
| 1353.0 | 0.993 |
| 1354.0 | 0.994 |
| 1355.0 | 0.994 |
| 1356.0 | 0.995 |
| 1357.0 | 0.995 |
| 1358.0 | 0.995 |
| 1359.0 | 0.996 |
| 1360.0 | 0.997 |
| 1361.0 | 0.997 |
| 1363.0 | 0.997 |
| 1364.0 | 0.998 |
| 1365.0 | 0.998 |
| 1366.0 | 0.998 |
| 1367.0 | 0.998 |
| 1369.0 | 0.998 |
| 1372.0 | 0.998 |
| 1377.0 | 0.998 |
| 1378.0 | 0.999 |
| 1382.0 | 0.999 |
| 1384.0 | 0.999 |
| 1392.0 | 0.999 |
| 1400.0 | 0.999 |
| 1401.0 | 0.999 |
| 1408.0 | 0.999 |
| 1412.0 | 0.999 |
| 1414.0 | 1 |
| 1417.0 | 1 |
| 1420.0 | 1 |
| 1422.0 | 1 |
| 1433.0 | 1 |